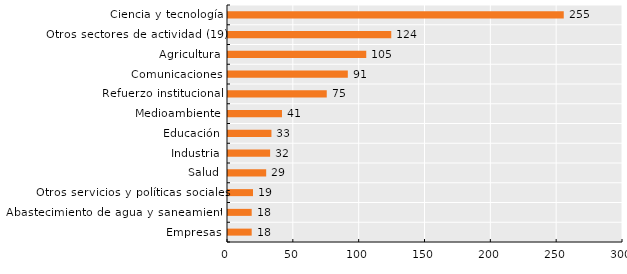
| Category | Series 0 |
|---|---|
| Empresas | 18 |
| Abastecimiento de agua y saneamiento | 18 |
| Otros servicios y políticas sociales | 19 |
| Salud | 29 |
| Industria | 32 |
| Educación | 33 |
| Medioambiente | 41 |
| Refuerzo institucional | 75 |
| Comunicaciones | 91 |
| Agricultura | 105 |
| Otros sectores de actividad (19) | 124 |
| Ciencia y tecnología | 255 |